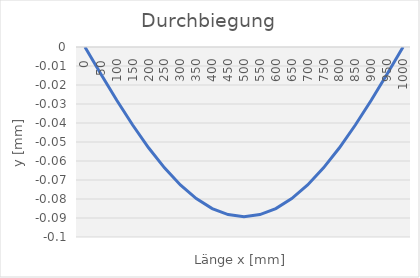
| Category | Series 0 |
|---|---|
| 0.0 | 0 |
| 50.0 | -0.014 |
| 100.0 | -0.028 |
| 150.0 | -0.041 |
| 200.0 | -0.053 |
| 250.0 | -0.064 |
| 300.0 | -0.073 |
| 350.0 | -0.08 |
| 400.0 | -0.085 |
| 450.0 | -0.088 |
| 500.0 | -0.089 |
| 550.0 | -0.088 |
| 600.0 | -0.085 |
| 650.0 | -0.08 |
| 700.0 | -0.073 |
| 750.0 | -0.064 |
| 800.0 | -0.053 |
| 850.0 | -0.041 |
| 900.0 | -0.028 |
| 950.0 | -0.014 |
| 1000.0 | 0 |